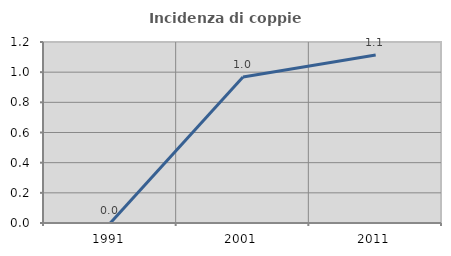
| Category | Incidenza di coppie miste |
|---|---|
| 1991.0 | 0 |
| 2001.0 | 0.968 |
| 2011.0 | 1.114 |